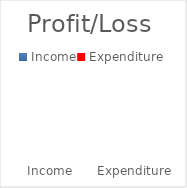
| Category | Series 0 |
|---|---|
| Income | 0 |
| Expenditure | 0 |